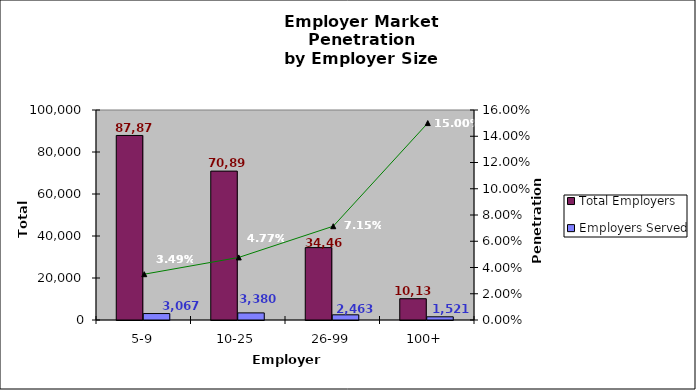
| Category | Total Employers | Employers Served |
|---|---|---|
| 5-9 | 87879 | 3067 |
| 10-25 | 70897 | 3380 |
| 26-99 | 34465 | 2463 |
| 100+ | 10139 | 1521 |